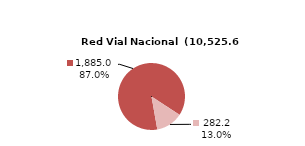
| Category | RV Nacional |
|---|---|
| Pavimentada | 1884.962 |
| No Pavimentada | 282.167 |